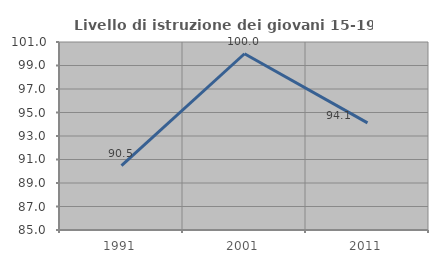
| Category | Livello di istruzione dei giovani 15-19 anni |
|---|---|
| 1991.0 | 90.476 |
| 2001.0 | 100 |
| 2011.0 | 94.118 |